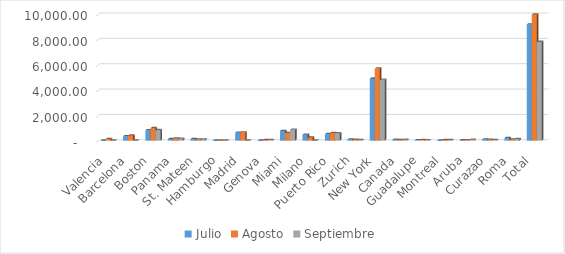
| Category | Julio | Agosto | Septiembre |
|---|---|---|---|
| Valencia | 0 | 121 | 0 |
| Barcelona | 346 | 394 | 0 |
| Boston | 824 | 985 | 828 |
| Panama | 127 | 169 | 144 |
| St. Mateen | 120 | 83 | 85 |
| Hamburgo | 0 | 0 | 0 |
| Madrid | 623 | 638 | 0 |
| Genova | 0 | 41 | 43 |
| Miami | 762 | 601 | 863 |
| Milano | 467 | 236 | 0 |
| Puerto Rico | 517 | 591 | 586 |
| Zurich | 92 | 63 | 51 |
| New York | 4890 | 5684 | 4794 |
| Canada | 65 | 54 | 76 |
| Guadalupe | 27 | 45 | 32 |
| Montreal | 0 | 39 | 40 |
| Aruba | 21 | 23 | 70 |
| Curazao | 88 | 75 | 45 |
| Roma | 199 | 96 | 133 |
| Total | 9168 | 9938 | 7790 |